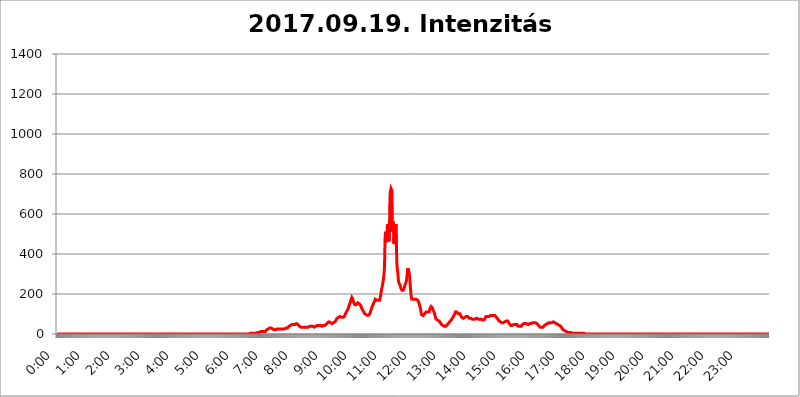
| Category | 2017.09.19. Intenzitás [W/m^2] |
|---|---|
| 0.0 | 0 |
| 0.0006944444444444445 | 0 |
| 0.001388888888888889 | 0 |
| 0.0020833333333333333 | 0 |
| 0.002777777777777778 | 0 |
| 0.003472222222222222 | 0 |
| 0.004166666666666667 | 0 |
| 0.004861111111111111 | 0 |
| 0.005555555555555556 | 0 |
| 0.0062499999999999995 | 0 |
| 0.006944444444444444 | 0 |
| 0.007638888888888889 | 0 |
| 0.008333333333333333 | 0 |
| 0.009027777777777779 | 0 |
| 0.009722222222222222 | 0 |
| 0.010416666666666666 | 0 |
| 0.011111111111111112 | 0 |
| 0.011805555555555555 | 0 |
| 0.012499999999999999 | 0 |
| 0.013194444444444444 | 0 |
| 0.013888888888888888 | 0 |
| 0.014583333333333332 | 0 |
| 0.015277777777777777 | 0 |
| 0.015972222222222224 | 0 |
| 0.016666666666666666 | 0 |
| 0.017361111111111112 | 0 |
| 0.018055555555555557 | 0 |
| 0.01875 | 0 |
| 0.019444444444444445 | 0 |
| 0.02013888888888889 | 0 |
| 0.020833333333333332 | 0 |
| 0.02152777777777778 | 0 |
| 0.022222222222222223 | 0 |
| 0.02291666666666667 | 0 |
| 0.02361111111111111 | 0 |
| 0.024305555555555556 | 0 |
| 0.024999999999999998 | 0 |
| 0.025694444444444447 | 0 |
| 0.02638888888888889 | 0 |
| 0.027083333333333334 | 0 |
| 0.027777777777777776 | 0 |
| 0.02847222222222222 | 0 |
| 0.029166666666666664 | 0 |
| 0.029861111111111113 | 0 |
| 0.030555555555555555 | 0 |
| 0.03125 | 0 |
| 0.03194444444444445 | 0 |
| 0.03263888888888889 | 0 |
| 0.03333333333333333 | 0 |
| 0.034027777777777775 | 0 |
| 0.034722222222222224 | 0 |
| 0.035416666666666666 | 0 |
| 0.036111111111111115 | 0 |
| 0.03680555555555556 | 0 |
| 0.0375 | 0 |
| 0.03819444444444444 | 0 |
| 0.03888888888888889 | 0 |
| 0.03958333333333333 | 0 |
| 0.04027777777777778 | 0 |
| 0.04097222222222222 | 0 |
| 0.041666666666666664 | 0 |
| 0.042361111111111106 | 0 |
| 0.04305555555555556 | 0 |
| 0.043750000000000004 | 0 |
| 0.044444444444444446 | 0 |
| 0.04513888888888889 | 0 |
| 0.04583333333333334 | 0 |
| 0.04652777777777778 | 0 |
| 0.04722222222222222 | 0 |
| 0.04791666666666666 | 0 |
| 0.04861111111111111 | 0 |
| 0.049305555555555554 | 0 |
| 0.049999999999999996 | 0 |
| 0.05069444444444445 | 0 |
| 0.051388888888888894 | 0 |
| 0.052083333333333336 | 0 |
| 0.05277777777777778 | 0 |
| 0.05347222222222222 | 0 |
| 0.05416666666666667 | 0 |
| 0.05486111111111111 | 0 |
| 0.05555555555555555 | 0 |
| 0.05625 | 0 |
| 0.05694444444444444 | 0 |
| 0.057638888888888885 | 0 |
| 0.05833333333333333 | 0 |
| 0.05902777777777778 | 0 |
| 0.059722222222222225 | 0 |
| 0.06041666666666667 | 0 |
| 0.061111111111111116 | 0 |
| 0.06180555555555556 | 0 |
| 0.0625 | 0 |
| 0.06319444444444444 | 0 |
| 0.06388888888888888 | 0 |
| 0.06458333333333334 | 0 |
| 0.06527777777777778 | 0 |
| 0.06597222222222222 | 0 |
| 0.06666666666666667 | 0 |
| 0.06736111111111111 | 0 |
| 0.06805555555555555 | 0 |
| 0.06874999999999999 | 0 |
| 0.06944444444444443 | 0 |
| 0.07013888888888889 | 0 |
| 0.07083333333333333 | 0 |
| 0.07152777777777779 | 0 |
| 0.07222222222222223 | 0 |
| 0.07291666666666667 | 0 |
| 0.07361111111111111 | 0 |
| 0.07430555555555556 | 0 |
| 0.075 | 0 |
| 0.07569444444444444 | 0 |
| 0.0763888888888889 | 0 |
| 0.07708333333333334 | 0 |
| 0.07777777777777778 | 0 |
| 0.07847222222222222 | 0 |
| 0.07916666666666666 | 0 |
| 0.0798611111111111 | 0 |
| 0.08055555555555556 | 0 |
| 0.08125 | 0 |
| 0.08194444444444444 | 0 |
| 0.08263888888888889 | 0 |
| 0.08333333333333333 | 0 |
| 0.08402777777777777 | 0 |
| 0.08472222222222221 | 0 |
| 0.08541666666666665 | 0 |
| 0.08611111111111112 | 0 |
| 0.08680555555555557 | 0 |
| 0.08750000000000001 | 0 |
| 0.08819444444444445 | 0 |
| 0.08888888888888889 | 0 |
| 0.08958333333333333 | 0 |
| 0.09027777777777778 | 0 |
| 0.09097222222222222 | 0 |
| 0.09166666666666667 | 0 |
| 0.09236111111111112 | 0 |
| 0.09305555555555556 | 0 |
| 0.09375 | 0 |
| 0.09444444444444444 | 0 |
| 0.09513888888888888 | 0 |
| 0.09583333333333333 | 0 |
| 0.09652777777777777 | 0 |
| 0.09722222222222222 | 0 |
| 0.09791666666666667 | 0 |
| 0.09861111111111111 | 0 |
| 0.09930555555555555 | 0 |
| 0.09999999999999999 | 0 |
| 0.10069444444444443 | 0 |
| 0.1013888888888889 | 0 |
| 0.10208333333333335 | 0 |
| 0.10277777777777779 | 0 |
| 0.10347222222222223 | 0 |
| 0.10416666666666667 | 0 |
| 0.10486111111111111 | 0 |
| 0.10555555555555556 | 0 |
| 0.10625 | 0 |
| 0.10694444444444444 | 0 |
| 0.1076388888888889 | 0 |
| 0.10833333333333334 | 0 |
| 0.10902777777777778 | 0 |
| 0.10972222222222222 | 0 |
| 0.1111111111111111 | 0 |
| 0.11180555555555556 | 0 |
| 0.11180555555555556 | 0 |
| 0.1125 | 0 |
| 0.11319444444444444 | 0 |
| 0.11388888888888889 | 0 |
| 0.11458333333333333 | 0 |
| 0.11527777777777777 | 0 |
| 0.11597222222222221 | 0 |
| 0.11666666666666665 | 0 |
| 0.1173611111111111 | 0 |
| 0.11805555555555557 | 0 |
| 0.11944444444444445 | 0 |
| 0.12013888888888889 | 0 |
| 0.12083333333333333 | 0 |
| 0.12152777777777778 | 0 |
| 0.12222222222222223 | 0 |
| 0.12291666666666667 | 0 |
| 0.12291666666666667 | 0 |
| 0.12361111111111112 | 0 |
| 0.12430555555555556 | 0 |
| 0.125 | 0 |
| 0.12569444444444444 | 0 |
| 0.12638888888888888 | 0 |
| 0.12708333333333333 | 0 |
| 0.16875 | 0 |
| 0.12847222222222224 | 0 |
| 0.12916666666666668 | 0 |
| 0.12986111111111112 | 0 |
| 0.13055555555555556 | 0 |
| 0.13125 | 0 |
| 0.13194444444444445 | 0 |
| 0.1326388888888889 | 0 |
| 0.13333333333333333 | 0 |
| 0.13402777777777777 | 0 |
| 0.13402777777777777 | 0 |
| 0.13472222222222222 | 0 |
| 0.13541666666666666 | 0 |
| 0.1361111111111111 | 0 |
| 0.13749999999999998 | 0 |
| 0.13819444444444443 | 0 |
| 0.1388888888888889 | 0 |
| 0.13958333333333334 | 0 |
| 0.14027777777777778 | 0 |
| 0.14097222222222222 | 0 |
| 0.14166666666666666 | 0 |
| 0.1423611111111111 | 0 |
| 0.14305555555555557 | 0 |
| 0.14375000000000002 | 0 |
| 0.14444444444444446 | 0 |
| 0.1451388888888889 | 0 |
| 0.1451388888888889 | 0 |
| 0.14652777777777778 | 0 |
| 0.14722222222222223 | 0 |
| 0.14791666666666667 | 0 |
| 0.1486111111111111 | 0 |
| 0.14930555555555555 | 0 |
| 0.15 | 0 |
| 0.15069444444444444 | 0 |
| 0.15138888888888888 | 0 |
| 0.15208333333333332 | 0 |
| 0.15277777777777776 | 0 |
| 0.15347222222222223 | 0 |
| 0.15416666666666667 | 0 |
| 0.15486111111111112 | 0 |
| 0.15555555555555556 | 0 |
| 0.15625 | 0 |
| 0.15694444444444444 | 0 |
| 0.15763888888888888 | 0 |
| 0.15833333333333333 | 0 |
| 0.15902777777777777 | 0 |
| 0.15972222222222224 | 0 |
| 0.16041666666666668 | 0 |
| 0.16111111111111112 | 0 |
| 0.16180555555555556 | 0 |
| 0.1625 | 0 |
| 0.16319444444444445 | 0 |
| 0.1638888888888889 | 0 |
| 0.16458333333333333 | 0 |
| 0.16527777777777777 | 0 |
| 0.16597222222222222 | 0 |
| 0.16666666666666666 | 0 |
| 0.1673611111111111 | 0 |
| 0.16805555555555554 | 0 |
| 0.16874999999999998 | 0 |
| 0.16944444444444443 | 0 |
| 0.17013888888888887 | 0 |
| 0.1708333333333333 | 0 |
| 0.17152777777777775 | 0 |
| 0.17222222222222225 | 0 |
| 0.1729166666666667 | 0 |
| 0.17361111111111113 | 0 |
| 0.17430555555555557 | 0 |
| 0.17500000000000002 | 0 |
| 0.17569444444444446 | 0 |
| 0.1763888888888889 | 0 |
| 0.17708333333333334 | 0 |
| 0.17777777777777778 | 0 |
| 0.17847222222222223 | 0 |
| 0.17916666666666667 | 0 |
| 0.1798611111111111 | 0 |
| 0.18055555555555555 | 0 |
| 0.18125 | 0 |
| 0.18194444444444444 | 0 |
| 0.1826388888888889 | 0 |
| 0.18333333333333335 | 0 |
| 0.1840277777777778 | 0 |
| 0.18472222222222223 | 0 |
| 0.18541666666666667 | 0 |
| 0.18611111111111112 | 0 |
| 0.18680555555555556 | 0 |
| 0.1875 | 0 |
| 0.18819444444444444 | 0 |
| 0.18888888888888888 | 0 |
| 0.18958333333333333 | 0 |
| 0.19027777777777777 | 0 |
| 0.1909722222222222 | 0 |
| 0.19166666666666665 | 0 |
| 0.19236111111111112 | 0 |
| 0.19305555555555554 | 0 |
| 0.19375 | 0 |
| 0.19444444444444445 | 0 |
| 0.1951388888888889 | 0 |
| 0.19583333333333333 | 0 |
| 0.19652777777777777 | 0 |
| 0.19722222222222222 | 0 |
| 0.19791666666666666 | 0 |
| 0.1986111111111111 | 0 |
| 0.19930555555555554 | 0 |
| 0.19999999999999998 | 0 |
| 0.20069444444444443 | 0 |
| 0.20138888888888887 | 0 |
| 0.2020833333333333 | 0 |
| 0.2027777777777778 | 0 |
| 0.2034722222222222 | 0 |
| 0.2041666666666667 | 0 |
| 0.20486111111111113 | 0 |
| 0.20555555555555557 | 0 |
| 0.20625000000000002 | 0 |
| 0.20694444444444446 | 0 |
| 0.2076388888888889 | 0 |
| 0.20833333333333334 | 0 |
| 0.20902777777777778 | 0 |
| 0.20972222222222223 | 0 |
| 0.21041666666666667 | 0 |
| 0.2111111111111111 | 0 |
| 0.21180555555555555 | 0 |
| 0.2125 | 0 |
| 0.21319444444444444 | 0 |
| 0.2138888888888889 | 0 |
| 0.21458333333333335 | 0 |
| 0.2152777777777778 | 0 |
| 0.21597222222222223 | 0 |
| 0.21666666666666667 | 0 |
| 0.21736111111111112 | 0 |
| 0.21805555555555556 | 0 |
| 0.21875 | 0 |
| 0.21944444444444444 | 0 |
| 0.22013888888888888 | 0 |
| 0.22083333333333333 | 0 |
| 0.22152777777777777 | 0 |
| 0.2222222222222222 | 0 |
| 0.22291666666666665 | 0 |
| 0.2236111111111111 | 0 |
| 0.22430555555555556 | 0 |
| 0.225 | 0 |
| 0.22569444444444445 | 0 |
| 0.2263888888888889 | 0 |
| 0.22708333333333333 | 0 |
| 0.22777777777777777 | 0 |
| 0.22847222222222222 | 0 |
| 0.22916666666666666 | 0 |
| 0.2298611111111111 | 0 |
| 0.23055555555555554 | 0 |
| 0.23124999999999998 | 0 |
| 0.23194444444444443 | 0 |
| 0.23263888888888887 | 0 |
| 0.2333333333333333 | 0 |
| 0.2340277777777778 | 0 |
| 0.2347222222222222 | 0 |
| 0.2354166666666667 | 0 |
| 0.23611111111111113 | 0 |
| 0.23680555555555557 | 0 |
| 0.23750000000000002 | 0 |
| 0.23819444444444446 | 0 |
| 0.2388888888888889 | 0 |
| 0.23958333333333334 | 0 |
| 0.24027777777777778 | 0 |
| 0.24097222222222223 | 0 |
| 0.24166666666666667 | 0 |
| 0.2423611111111111 | 0 |
| 0.24305555555555555 | 0 |
| 0.24375 | 0 |
| 0.24444444444444446 | 0 |
| 0.24513888888888888 | 0 |
| 0.24583333333333335 | 0 |
| 0.2465277777777778 | 0 |
| 0.24722222222222223 | 0 |
| 0.24791666666666667 | 0 |
| 0.24861111111111112 | 0 |
| 0.24930555555555556 | 0 |
| 0.25 | 0 |
| 0.25069444444444444 | 0 |
| 0.2513888888888889 | 0 |
| 0.2520833333333333 | 0 |
| 0.25277777777777777 | 0 |
| 0.2534722222222222 | 0 |
| 0.25416666666666665 | 0 |
| 0.2548611111111111 | 0 |
| 0.2555555555555556 | 0 |
| 0.25625000000000003 | 0 |
| 0.2569444444444445 | 0 |
| 0.2576388888888889 | 0 |
| 0.25833333333333336 | 0 |
| 0.2590277777777778 | 0 |
| 0.25972222222222224 | 0 |
| 0.2604166666666667 | 0 |
| 0.2611111111111111 | 0 |
| 0.26180555555555557 | 0 |
| 0.2625 | 0 |
| 0.26319444444444445 | 0 |
| 0.2638888888888889 | 0 |
| 0.26458333333333334 | 0 |
| 0.2652777777777778 | 0 |
| 0.2659722222222222 | 0 |
| 0.26666666666666666 | 0 |
| 0.2673611111111111 | 0 |
| 0.26805555555555555 | 0 |
| 0.26875 | 0 |
| 0.26944444444444443 | 0 |
| 0.2701388888888889 | 0 |
| 0.2708333333333333 | 3.525 |
| 0.27152777777777776 | 3.525 |
| 0.2722222222222222 | 3.525 |
| 0.27291666666666664 | 3.525 |
| 0.2736111111111111 | 3.525 |
| 0.2743055555555555 | 3.525 |
| 0.27499999999999997 | 3.525 |
| 0.27569444444444446 | 3.525 |
| 0.27638888888888885 | 3.525 |
| 0.27708333333333335 | 3.525 |
| 0.2777777777777778 | 3.525 |
| 0.27847222222222223 | 3.525 |
| 0.2791666666666667 | 3.525 |
| 0.2798611111111111 | 7.887 |
| 0.28055555555555556 | 7.887 |
| 0.28125 | 7.887 |
| 0.28194444444444444 | 7.887 |
| 0.2826388888888889 | 7.887 |
| 0.2833333333333333 | 7.887 |
| 0.28402777777777777 | 12.257 |
| 0.2847222222222222 | 12.257 |
| 0.28541666666666665 | 12.257 |
| 0.28611111111111115 | 12.257 |
| 0.28680555555555554 | 12.257 |
| 0.28750000000000003 | 12.257 |
| 0.2881944444444445 | 12.257 |
| 0.2888888888888889 | 12.257 |
| 0.28958333333333336 | 12.257 |
| 0.2902777777777778 | 12.257 |
| 0.29097222222222224 | 12.257 |
| 0.2916666666666667 | 12.257 |
| 0.2923611111111111 | 16.636 |
| 0.29305555555555557 | 16.636 |
| 0.29375 | 21.024 |
| 0.29444444444444445 | 21.024 |
| 0.2951388888888889 | 21.024 |
| 0.29583333333333334 | 25.419 |
| 0.2965277777777778 | 29.823 |
| 0.2972222222222222 | 29.823 |
| 0.29791666666666666 | 29.823 |
| 0.2986111111111111 | 29.823 |
| 0.29930555555555555 | 29.823 |
| 0.3 | 29.823 |
| 0.30069444444444443 | 25.419 |
| 0.3013888888888889 | 25.419 |
| 0.3020833333333333 | 25.419 |
| 0.30277777777777776 | 21.024 |
| 0.3034722222222222 | 21.024 |
| 0.30416666666666664 | 21.024 |
| 0.3048611111111111 | 21.024 |
| 0.3055555555555555 | 21.024 |
| 0.30624999999999997 | 21.024 |
| 0.3069444444444444 | 21.024 |
| 0.3076388888888889 | 21.024 |
| 0.30833333333333335 | 25.419 |
| 0.3090277777777778 | 25.419 |
| 0.30972222222222223 | 25.419 |
| 0.3104166666666667 | 25.419 |
| 0.3111111111111111 | 25.419 |
| 0.31180555555555556 | 25.419 |
| 0.3125 | 25.419 |
| 0.31319444444444444 | 25.419 |
| 0.3138888888888889 | 25.419 |
| 0.3145833333333333 | 25.419 |
| 0.31527777777777777 | 25.419 |
| 0.3159722222222222 | 25.419 |
| 0.31666666666666665 | 25.419 |
| 0.31736111111111115 | 25.419 |
| 0.31805555555555554 | 25.419 |
| 0.31875000000000003 | 25.419 |
| 0.3194444444444445 | 25.419 |
| 0.3201388888888889 | 25.419 |
| 0.32083333333333336 | 29.823 |
| 0.3215277777777778 | 29.823 |
| 0.32222222222222224 | 29.823 |
| 0.3229166666666667 | 29.823 |
| 0.3236111111111111 | 29.823 |
| 0.32430555555555557 | 34.234 |
| 0.325 | 38.653 |
| 0.32569444444444445 | 38.653 |
| 0.3263888888888889 | 43.079 |
| 0.32708333333333334 | 43.079 |
| 0.3277777777777778 | 47.511 |
| 0.3284722222222222 | 47.511 |
| 0.32916666666666666 | 47.511 |
| 0.3298611111111111 | 47.511 |
| 0.33055555555555555 | 47.511 |
| 0.33125 | 47.511 |
| 0.33194444444444443 | 47.511 |
| 0.3326388888888889 | 47.511 |
| 0.3333333333333333 | 47.511 |
| 0.3340277777777778 | 47.511 |
| 0.3347222222222222 | 51.951 |
| 0.3354166666666667 | 51.951 |
| 0.3361111111111111 | 51.951 |
| 0.3368055555555556 | 51.951 |
| 0.33749999999999997 | 47.511 |
| 0.33819444444444446 | 47.511 |
| 0.33888888888888885 | 43.079 |
| 0.33958333333333335 | 38.653 |
| 0.34027777777777773 | 38.653 |
| 0.34097222222222223 | 34.234 |
| 0.3416666666666666 | 34.234 |
| 0.3423611111111111 | 34.234 |
| 0.3430555555555555 | 34.234 |
| 0.34375 | 34.234 |
| 0.3444444444444445 | 34.234 |
| 0.3451388888888889 | 34.234 |
| 0.3458333333333334 | 34.234 |
| 0.34652777777777777 | 34.234 |
| 0.34722222222222227 | 34.234 |
| 0.34791666666666665 | 34.234 |
| 0.34861111111111115 | 34.234 |
| 0.34930555555555554 | 34.234 |
| 0.35000000000000003 | 34.234 |
| 0.3506944444444444 | 34.234 |
| 0.3513888888888889 | 34.234 |
| 0.3520833333333333 | 34.234 |
| 0.3527777777777778 | 38.653 |
| 0.3534722222222222 | 38.653 |
| 0.3541666666666667 | 38.653 |
| 0.3548611111111111 | 38.653 |
| 0.35555555555555557 | 38.653 |
| 0.35625 | 38.653 |
| 0.35694444444444445 | 38.653 |
| 0.3576388888888889 | 38.653 |
| 0.35833333333333334 | 38.653 |
| 0.3590277777777778 | 34.234 |
| 0.3597222222222222 | 34.234 |
| 0.36041666666666666 | 34.234 |
| 0.3611111111111111 | 34.234 |
| 0.36180555555555555 | 38.653 |
| 0.3625 | 38.653 |
| 0.36319444444444443 | 38.653 |
| 0.3638888888888889 | 38.653 |
| 0.3645833333333333 | 43.079 |
| 0.3652777777777778 | 43.079 |
| 0.3659722222222222 | 43.079 |
| 0.3666666666666667 | 43.079 |
| 0.3673611111111111 | 43.079 |
| 0.3680555555555556 | 43.079 |
| 0.36874999999999997 | 43.079 |
| 0.36944444444444446 | 43.079 |
| 0.37013888888888885 | 43.079 |
| 0.37083333333333335 | 38.653 |
| 0.37152777777777773 | 43.079 |
| 0.37222222222222223 | 43.079 |
| 0.3729166666666666 | 43.079 |
| 0.3736111111111111 | 43.079 |
| 0.3743055555555555 | 43.079 |
| 0.375 | 43.079 |
| 0.3756944444444445 | 43.079 |
| 0.3763888888888889 | 47.511 |
| 0.3770833333333334 | 47.511 |
| 0.37777777777777777 | 51.951 |
| 0.37847222222222227 | 51.951 |
| 0.37916666666666665 | 56.398 |
| 0.37986111111111115 | 60.85 |
| 0.38055555555555554 | 60.85 |
| 0.38125000000000003 | 60.85 |
| 0.3819444444444444 | 60.85 |
| 0.3826388888888889 | 56.398 |
| 0.3833333333333333 | 56.398 |
| 0.3840277777777778 | 56.398 |
| 0.3847222222222222 | 51.951 |
| 0.3854166666666667 | 51.951 |
| 0.3861111111111111 | 51.951 |
| 0.38680555555555557 | 51.951 |
| 0.3875 | 56.398 |
| 0.38819444444444445 | 56.398 |
| 0.3888888888888889 | 60.85 |
| 0.38958333333333334 | 60.85 |
| 0.3902777777777778 | 65.31 |
| 0.3909722222222222 | 69.775 |
| 0.39166666666666666 | 74.246 |
| 0.3923611111111111 | 78.722 |
| 0.39305555555555555 | 83.205 |
| 0.39375 | 83.205 |
| 0.39444444444444443 | 83.205 |
| 0.3951388888888889 | 87.692 |
| 0.3958333333333333 | 87.692 |
| 0.3965277777777778 | 87.692 |
| 0.3972222222222222 | 87.692 |
| 0.3979166666666667 | 83.205 |
| 0.3986111111111111 | 83.205 |
| 0.3993055555555556 | 83.205 |
| 0.39999999999999997 | 78.722 |
| 0.40069444444444446 | 83.205 |
| 0.40138888888888885 | 83.205 |
| 0.40208333333333335 | 83.205 |
| 0.40277777777777773 | 87.692 |
| 0.40347222222222223 | 92.184 |
| 0.4041666666666666 | 101.184 |
| 0.4048611111111111 | 101.184 |
| 0.4055555555555555 | 110.201 |
| 0.40625 | 114.716 |
| 0.4069444444444445 | 119.235 |
| 0.4076388888888889 | 123.758 |
| 0.4083333333333334 | 128.284 |
| 0.40902777777777777 | 137.347 |
| 0.40972222222222227 | 146.423 |
| 0.41041666666666665 | 150.964 |
| 0.41111111111111115 | 160.056 |
| 0.41180555555555554 | 169.156 |
| 0.41250000000000003 | 173.709 |
| 0.4131944444444444 | 182.82 |
| 0.4138888888888889 | 182.82 |
| 0.4145833333333333 | 173.709 |
| 0.4152777777777778 | 164.605 |
| 0.4159722222222222 | 155.509 |
| 0.4166666666666667 | 150.964 |
| 0.4173611111111111 | 146.423 |
| 0.41805555555555557 | 141.884 |
| 0.41875 | 141.884 |
| 0.41944444444444445 | 146.423 |
| 0.4201388888888889 | 146.423 |
| 0.42083333333333334 | 150.964 |
| 0.4215277777777778 | 155.509 |
| 0.4222222222222222 | 155.509 |
| 0.42291666666666666 | 155.509 |
| 0.4236111111111111 | 150.964 |
| 0.42430555555555555 | 150.964 |
| 0.425 | 146.423 |
| 0.42569444444444443 | 141.884 |
| 0.4263888888888889 | 137.347 |
| 0.4270833333333333 | 128.284 |
| 0.4277777777777778 | 123.758 |
| 0.4284722222222222 | 119.235 |
| 0.4291666666666667 | 114.716 |
| 0.4298611111111111 | 110.201 |
| 0.4305555555555556 | 105.69 |
| 0.43124999999999997 | 101.184 |
| 0.43194444444444446 | 101.184 |
| 0.43263888888888885 | 96.682 |
| 0.43333333333333335 | 96.682 |
| 0.43402777777777773 | 92.184 |
| 0.43472222222222223 | 92.184 |
| 0.4354166666666666 | 92.184 |
| 0.4361111111111111 | 92.184 |
| 0.4368055555555555 | 92.184 |
| 0.4375 | 96.682 |
| 0.4381944444444445 | 101.184 |
| 0.4388888888888889 | 105.69 |
| 0.4395833333333334 | 114.716 |
| 0.44027777777777777 | 119.235 |
| 0.44097222222222227 | 128.284 |
| 0.44166666666666665 | 137.347 |
| 0.44236111111111115 | 141.884 |
| 0.44305555555555554 | 146.423 |
| 0.44375000000000003 | 155.509 |
| 0.4444444444444444 | 160.056 |
| 0.4451388888888889 | 164.605 |
| 0.4458333333333333 | 173.709 |
| 0.4465277777777778 | 173.709 |
| 0.4472222222222222 | 173.709 |
| 0.4479166666666667 | 169.156 |
| 0.4486111111111111 | 164.605 |
| 0.44930555555555557 | 164.605 |
| 0.45 | 169.156 |
| 0.45069444444444445 | 169.156 |
| 0.4513888888888889 | 169.156 |
| 0.45208333333333334 | 169.156 |
| 0.4527777777777778 | 178.264 |
| 0.4534722222222222 | 191.937 |
| 0.45416666666666666 | 205.62 |
| 0.4548611111111111 | 223.873 |
| 0.45555555555555555 | 233 |
| 0.45625 | 246.689 |
| 0.45694444444444443 | 260.373 |
| 0.4576388888888889 | 278.603 |
| 0.4583333333333333 | 301.354 |
| 0.4590277777777778 | 342.162 |
| 0.4597222222222222 | 471.582 |
| 0.4604166666666667 | 510.885 |
| 0.4611111111111111 | 458.38 |
| 0.4618055555555556 | 462.786 |
| 0.46249999999999997 | 502.192 |
| 0.46319444444444446 | 549.704 |
| 0.46388888888888885 | 549.704 |
| 0.46458333333333335 | 502.192 |
| 0.46527777777777773 | 462.786 |
| 0.46597222222222223 | 523.88 |
| 0.4666666666666666 | 683.473 |
| 0.4673611111111111 | 715.858 |
| 0.4680555555555555 | 727.896 |
| 0.46875 | 727.896 |
| 0.4694444444444445 | 715.858 |
| 0.4701388888888889 | 510.885 |
| 0.4708333333333334 | 562.53 |
| 0.47152777777777777 | 536.82 |
| 0.47222222222222227 | 449.551 |
| 0.47291666666666665 | 528.2 |
| 0.47361111111111115 | 510.885 |
| 0.47430555555555554 | 536.82 |
| 0.47500000000000003 | 549.704 |
| 0.4756944444444444 | 431.833 |
| 0.4763888888888889 | 346.682 |
| 0.4770833333333333 | 324.052 |
| 0.4777777777777778 | 301.354 |
| 0.4784722222222222 | 269.49 |
| 0.4791666666666667 | 255.813 |
| 0.4798611111111111 | 251.251 |
| 0.48055555555555557 | 246.689 |
| 0.48125 | 237.564 |
| 0.48194444444444445 | 228.436 |
| 0.4826388888888889 | 223.873 |
| 0.48333333333333334 | 219.309 |
| 0.4840277777777778 | 214.746 |
| 0.4847222222222222 | 214.746 |
| 0.48541666666666666 | 219.309 |
| 0.4861111111111111 | 223.873 |
| 0.48680555555555555 | 233 |
| 0.4875 | 242.127 |
| 0.48819444444444443 | 246.689 |
| 0.4888888888888889 | 255.813 |
| 0.4895833333333333 | 264.932 |
| 0.4902777777777778 | 283.156 |
| 0.4909722222222222 | 305.898 |
| 0.4916666666666667 | 328.584 |
| 0.4923611111111111 | 324.052 |
| 0.4930555555555556 | 314.98 |
| 0.49374999999999997 | 301.354 |
| 0.49444444444444446 | 278.603 |
| 0.49513888888888885 | 242.127 |
| 0.49583333333333335 | 210.182 |
| 0.49652777777777773 | 187.378 |
| 0.49722222222222223 | 173.709 |
| 0.4979166666666666 | 169.156 |
| 0.4986111111111111 | 173.709 |
| 0.4993055555555555 | 173.709 |
| 0.5 | 178.264 |
| 0.5006944444444444 | 178.264 |
| 0.5013888888888889 | 173.709 |
| 0.5020833333333333 | 173.709 |
| 0.5027777777777778 | 173.709 |
| 0.5034722222222222 | 173.709 |
| 0.5041666666666667 | 173.709 |
| 0.5048611111111111 | 169.156 |
| 0.5055555555555555 | 169.156 |
| 0.50625 | 164.605 |
| 0.5069444444444444 | 160.056 |
| 0.5076388888888889 | 150.964 |
| 0.5083333333333333 | 141.884 |
| 0.5090277777777777 | 132.814 |
| 0.5097222222222222 | 119.235 |
| 0.5104166666666666 | 105.69 |
| 0.5111111111111112 | 96.682 |
| 0.5118055555555555 | 92.184 |
| 0.5125000000000001 | 92.184 |
| 0.5131944444444444 | 92.184 |
| 0.513888888888889 | 92.184 |
| 0.5145833333333333 | 92.184 |
| 0.5152777777777778 | 101.184 |
| 0.5159722222222222 | 101.184 |
| 0.5166666666666667 | 105.69 |
| 0.517361111111111 | 110.201 |
| 0.5180555555555556 | 110.201 |
| 0.5187499999999999 | 105.69 |
| 0.5194444444444445 | 110.201 |
| 0.5201388888888888 | 105.69 |
| 0.5208333333333334 | 110.201 |
| 0.5215277777777778 | 110.201 |
| 0.5222222222222223 | 119.235 |
| 0.5229166666666667 | 128.284 |
| 0.5236111111111111 | 132.814 |
| 0.5243055555555556 | 137.347 |
| 0.525 | 137.347 |
| 0.5256944444444445 | 137.347 |
| 0.5263888888888889 | 128.284 |
| 0.5270833333333333 | 119.235 |
| 0.5277777777777778 | 114.716 |
| 0.5284722222222222 | 110.201 |
| 0.5291666666666667 | 101.184 |
| 0.5298611111111111 | 92.184 |
| 0.5305555555555556 | 83.205 |
| 0.53125 | 74.246 |
| 0.5319444444444444 | 74.246 |
| 0.5326388888888889 | 74.246 |
| 0.5333333333333333 | 69.775 |
| 0.5340277777777778 | 69.775 |
| 0.5347222222222222 | 69.775 |
| 0.5354166666666667 | 65.31 |
| 0.5361111111111111 | 65.31 |
| 0.5368055555555555 | 60.85 |
| 0.5375 | 56.398 |
| 0.5381944444444444 | 51.951 |
| 0.5388888888888889 | 47.511 |
| 0.5395833333333333 | 43.079 |
| 0.5402777777777777 | 43.079 |
| 0.5409722222222222 | 43.079 |
| 0.5416666666666666 | 38.653 |
| 0.5423611111111112 | 38.653 |
| 0.5430555555555555 | 38.653 |
| 0.5437500000000001 | 38.653 |
| 0.5444444444444444 | 38.653 |
| 0.545138888888889 | 38.653 |
| 0.5458333333333333 | 43.079 |
| 0.5465277777777778 | 43.079 |
| 0.5472222222222222 | 47.511 |
| 0.5479166666666667 | 51.951 |
| 0.548611111111111 | 51.951 |
| 0.5493055555555556 | 56.398 |
| 0.5499999999999999 | 56.398 |
| 0.5506944444444445 | 60.85 |
| 0.5513888888888888 | 65.31 |
| 0.5520833333333334 | 65.31 |
| 0.5527777777777778 | 69.775 |
| 0.5534722222222223 | 74.246 |
| 0.5541666666666667 | 78.722 |
| 0.5548611111111111 | 83.205 |
| 0.5555555555555556 | 87.692 |
| 0.55625 | 92.184 |
| 0.5569444444444445 | 96.682 |
| 0.5576388888888889 | 101.184 |
| 0.5583333333333333 | 110.201 |
| 0.5590277777777778 | 110.201 |
| 0.5597222222222222 | 110.201 |
| 0.5604166666666667 | 110.201 |
| 0.5611111111111111 | 110.201 |
| 0.5618055555555556 | 105.69 |
| 0.5625 | 101.184 |
| 0.5631944444444444 | 101.184 |
| 0.5638888888888889 | 101.184 |
| 0.5645833333333333 | 101.184 |
| 0.5652777777777778 | 96.682 |
| 0.5659722222222222 | 92.184 |
| 0.5666666666666667 | 87.692 |
| 0.5673611111111111 | 83.205 |
| 0.5680555555555555 | 83.205 |
| 0.56875 | 78.722 |
| 0.5694444444444444 | 78.722 |
| 0.5701388888888889 | 83.205 |
| 0.5708333333333333 | 83.205 |
| 0.5715277777777777 | 83.205 |
| 0.5722222222222222 | 83.205 |
| 0.5729166666666666 | 87.692 |
| 0.5736111111111112 | 87.692 |
| 0.5743055555555555 | 87.692 |
| 0.5750000000000001 | 87.692 |
| 0.5756944444444444 | 87.692 |
| 0.576388888888889 | 83.205 |
| 0.5770833333333333 | 83.205 |
| 0.5777777777777778 | 78.722 |
| 0.5784722222222222 | 78.722 |
| 0.5791666666666667 | 78.722 |
| 0.579861111111111 | 78.722 |
| 0.5805555555555556 | 78.722 |
| 0.5812499999999999 | 74.246 |
| 0.5819444444444445 | 74.246 |
| 0.5826388888888888 | 74.246 |
| 0.5833333333333334 | 74.246 |
| 0.5840277777777778 | 74.246 |
| 0.5847222222222223 | 74.246 |
| 0.5854166666666667 | 74.246 |
| 0.5861111111111111 | 74.246 |
| 0.5868055555555556 | 78.722 |
| 0.5875 | 78.722 |
| 0.5881944444444445 | 78.722 |
| 0.5888888888888889 | 78.722 |
| 0.5895833333333333 | 74.246 |
| 0.5902777777777778 | 74.246 |
| 0.5909722222222222 | 74.246 |
| 0.5916666666666667 | 74.246 |
| 0.5923611111111111 | 74.246 |
| 0.5930555555555556 | 78.722 |
| 0.59375 | 78.722 |
| 0.5944444444444444 | 74.246 |
| 0.5951388888888889 | 74.246 |
| 0.5958333333333333 | 74.246 |
| 0.5965277777777778 | 69.775 |
| 0.5972222222222222 | 69.775 |
| 0.5979166666666667 | 69.775 |
| 0.5986111111111111 | 69.775 |
| 0.5993055555555555 | 74.246 |
| 0.6 | 78.722 |
| 0.6006944444444444 | 83.205 |
| 0.6013888888888889 | 87.692 |
| 0.6020833333333333 | 87.692 |
| 0.6027777777777777 | 92.184 |
| 0.6034722222222222 | 87.692 |
| 0.6041666666666666 | 92.184 |
| 0.6048611111111112 | 87.692 |
| 0.6055555555555555 | 87.692 |
| 0.6062500000000001 | 92.184 |
| 0.6069444444444444 | 92.184 |
| 0.607638888888889 | 92.184 |
| 0.6083333333333333 | 92.184 |
| 0.6090277777777778 | 92.184 |
| 0.6097222222222222 | 92.184 |
| 0.6104166666666667 | 92.184 |
| 0.611111111111111 | 92.184 |
| 0.6118055555555556 | 92.184 |
| 0.6124999999999999 | 92.184 |
| 0.6131944444444445 | 92.184 |
| 0.6138888888888888 | 92.184 |
| 0.6145833333333334 | 92.184 |
| 0.6152777777777778 | 87.692 |
| 0.6159722222222223 | 83.205 |
| 0.6166666666666667 | 83.205 |
| 0.6173611111111111 | 78.722 |
| 0.6180555555555556 | 74.246 |
| 0.61875 | 69.775 |
| 0.6194444444444445 | 65.31 |
| 0.6201388888888889 | 65.31 |
| 0.6208333333333333 | 60.85 |
| 0.6215277777777778 | 60.85 |
| 0.6222222222222222 | 60.85 |
| 0.6229166666666667 | 56.398 |
| 0.6236111111111111 | 56.398 |
| 0.6243055555555556 | 56.398 |
| 0.625 | 56.398 |
| 0.6256944444444444 | 56.398 |
| 0.6263888888888889 | 56.398 |
| 0.6270833333333333 | 60.85 |
| 0.6277777777777778 | 60.85 |
| 0.6284722222222222 | 65.31 |
| 0.6291666666666667 | 65.31 |
| 0.6298611111111111 | 65.31 |
| 0.6305555555555555 | 65.31 |
| 0.63125 | 65.31 |
| 0.6319444444444444 | 65.31 |
| 0.6326388888888889 | 60.85 |
| 0.6333333333333333 | 60.85 |
| 0.6340277777777777 | 51.951 |
| 0.6347222222222222 | 47.511 |
| 0.6354166666666666 | 47.511 |
| 0.6361111111111112 | 43.079 |
| 0.6368055555555555 | 43.079 |
| 0.6375000000000001 | 43.079 |
| 0.6381944444444444 | 43.079 |
| 0.638888888888889 | 43.079 |
| 0.6395833333333333 | 47.511 |
| 0.6402777777777778 | 47.511 |
| 0.6409722222222222 | 47.511 |
| 0.6416666666666667 | 47.511 |
| 0.642361111111111 | 47.511 |
| 0.6430555555555556 | 47.511 |
| 0.6437499999999999 | 47.511 |
| 0.6444444444444445 | 47.511 |
| 0.6451388888888888 | 47.511 |
| 0.6458333333333334 | 43.079 |
| 0.6465277777777778 | 38.653 |
| 0.6472222222222223 | 38.653 |
| 0.6479166666666667 | 38.653 |
| 0.6486111111111111 | 38.653 |
| 0.6493055555555556 | 38.653 |
| 0.65 | 38.653 |
| 0.6506944444444445 | 38.653 |
| 0.6513888888888889 | 43.079 |
| 0.6520833333333333 | 47.511 |
| 0.6527777777777778 | 47.511 |
| 0.6534722222222222 | 47.511 |
| 0.6541666666666667 | 51.951 |
| 0.6548611111111111 | 51.951 |
| 0.6555555555555556 | 51.951 |
| 0.65625 | 51.951 |
| 0.6569444444444444 | 51.951 |
| 0.6576388888888889 | 51.951 |
| 0.6583333333333333 | 51.951 |
| 0.6590277777777778 | 47.511 |
| 0.6597222222222222 | 47.511 |
| 0.6604166666666667 | 47.511 |
| 0.6611111111111111 | 47.511 |
| 0.6618055555555555 | 47.511 |
| 0.6625 | 51.951 |
| 0.6631944444444444 | 51.951 |
| 0.6638888888888889 | 56.398 |
| 0.6645833333333333 | 51.951 |
| 0.6652777777777777 | 56.398 |
| 0.6659722222222222 | 56.398 |
| 0.6666666666666666 | 56.398 |
| 0.6673611111111111 | 56.398 |
| 0.6680555555555556 | 56.398 |
| 0.6687500000000001 | 56.398 |
| 0.6694444444444444 | 56.398 |
| 0.6701388888888888 | 51.951 |
| 0.6708333333333334 | 56.398 |
| 0.6715277777777778 | 56.398 |
| 0.6722222222222222 | 51.951 |
| 0.6729166666666666 | 51.951 |
| 0.6736111111111112 | 47.511 |
| 0.6743055555555556 | 47.511 |
| 0.6749999999999999 | 43.079 |
| 0.6756944444444444 | 38.653 |
| 0.6763888888888889 | 38.653 |
| 0.6770833333333334 | 34.234 |
| 0.6777777777777777 | 34.234 |
| 0.6784722222222223 | 34.234 |
| 0.6791666666666667 | 34.234 |
| 0.6798611111111111 | 34.234 |
| 0.6805555555555555 | 34.234 |
| 0.68125 | 34.234 |
| 0.6819444444444445 | 38.653 |
| 0.6826388888888889 | 38.653 |
| 0.6833333333333332 | 43.079 |
| 0.6840277777777778 | 43.079 |
| 0.6847222222222222 | 47.511 |
| 0.6854166666666667 | 47.511 |
| 0.686111111111111 | 47.511 |
| 0.6868055555555556 | 47.511 |
| 0.6875 | 51.951 |
| 0.6881944444444444 | 51.951 |
| 0.688888888888889 | 56.398 |
| 0.6895833333333333 | 56.398 |
| 0.6902777777777778 | 56.398 |
| 0.6909722222222222 | 60.85 |
| 0.6916666666666668 | 56.398 |
| 0.6923611111111111 | 56.398 |
| 0.6930555555555555 | 56.398 |
| 0.69375 | 56.398 |
| 0.6944444444444445 | 60.85 |
| 0.6951388888888889 | 60.85 |
| 0.6958333333333333 | 60.85 |
| 0.6965277777777777 | 60.85 |
| 0.6972222222222223 | 60.85 |
| 0.6979166666666666 | 56.398 |
| 0.6986111111111111 | 56.398 |
| 0.6993055555555556 | 51.951 |
| 0.7000000000000001 | 51.951 |
| 0.7006944444444444 | 51.951 |
| 0.7013888888888888 | 47.511 |
| 0.7020833333333334 | 47.511 |
| 0.7027777777777778 | 47.511 |
| 0.7034722222222222 | 43.079 |
| 0.7041666666666666 | 43.079 |
| 0.7048611111111112 | 43.079 |
| 0.7055555555555556 | 38.653 |
| 0.7062499999999999 | 38.653 |
| 0.7069444444444444 | 34.234 |
| 0.7076388888888889 | 29.823 |
| 0.7083333333333334 | 29.823 |
| 0.7090277777777777 | 25.419 |
| 0.7097222222222223 | 21.024 |
| 0.7104166666666667 | 21.024 |
| 0.7111111111111111 | 16.636 |
| 0.7118055555555555 | 16.636 |
| 0.7125 | 12.257 |
| 0.7131944444444445 | 12.257 |
| 0.7138888888888889 | 12.257 |
| 0.7145833333333332 | 12.257 |
| 0.7152777777777778 | 12.257 |
| 0.7159722222222222 | 7.887 |
| 0.7166666666666667 | 7.887 |
| 0.717361111111111 | 7.887 |
| 0.7180555555555556 | 7.887 |
| 0.71875 | 7.887 |
| 0.7194444444444444 | 7.887 |
| 0.720138888888889 | 7.887 |
| 0.7208333333333333 | 7.887 |
| 0.7215277777777778 | 3.525 |
| 0.7222222222222222 | 3.525 |
| 0.7229166666666668 | 3.525 |
| 0.7236111111111111 | 3.525 |
| 0.7243055555555555 | 3.525 |
| 0.725 | 3.525 |
| 0.7256944444444445 | 3.525 |
| 0.7263888888888889 | 3.525 |
| 0.7270833333333333 | 3.525 |
| 0.7277777777777777 | 3.525 |
| 0.7284722222222223 | 3.525 |
| 0.7291666666666666 | 3.525 |
| 0.7298611111111111 | 3.525 |
| 0.7305555555555556 | 3.525 |
| 0.7312500000000001 | 3.525 |
| 0.7319444444444444 | 3.525 |
| 0.7326388888888888 | 3.525 |
| 0.7333333333333334 | 3.525 |
| 0.7340277777777778 | 3.525 |
| 0.7347222222222222 | 3.525 |
| 0.7354166666666666 | 0 |
| 0.7361111111111112 | 3.525 |
| 0.7368055555555556 | 3.525 |
| 0.7374999999999999 | 0 |
| 0.7381944444444444 | 0 |
| 0.7388888888888889 | 3.525 |
| 0.7395833333333334 | 0 |
| 0.7402777777777777 | 0 |
| 0.7409722222222223 | 0 |
| 0.7416666666666667 | 0 |
| 0.7423611111111111 | 0 |
| 0.7430555555555555 | 0 |
| 0.74375 | 0 |
| 0.7444444444444445 | 3.525 |
| 0.7451388888888889 | 0 |
| 0.7458333333333332 | 0 |
| 0.7465277777777778 | 0 |
| 0.7472222222222222 | 0 |
| 0.7479166666666667 | 0 |
| 0.748611111111111 | 0 |
| 0.7493055555555556 | 0 |
| 0.75 | 0 |
| 0.7506944444444444 | 0 |
| 0.751388888888889 | 0 |
| 0.7520833333333333 | 0 |
| 0.7527777777777778 | 0 |
| 0.7534722222222222 | 0 |
| 0.7541666666666668 | 0 |
| 0.7548611111111111 | 0 |
| 0.7555555555555555 | 0 |
| 0.75625 | 0 |
| 0.7569444444444445 | 0 |
| 0.7576388888888889 | 0 |
| 0.7583333333333333 | 0 |
| 0.7590277777777777 | 0 |
| 0.7597222222222223 | 0 |
| 0.7604166666666666 | 0 |
| 0.7611111111111111 | 0 |
| 0.7618055555555556 | 0 |
| 0.7625000000000001 | 0 |
| 0.7631944444444444 | 0 |
| 0.7638888888888888 | 0 |
| 0.7645833333333334 | 0 |
| 0.7652777777777778 | 0 |
| 0.7659722222222222 | 0 |
| 0.7666666666666666 | 0 |
| 0.7673611111111112 | 0 |
| 0.7680555555555556 | 0 |
| 0.7687499999999999 | 0 |
| 0.7694444444444444 | 0 |
| 0.7701388888888889 | 0 |
| 0.7708333333333334 | 0 |
| 0.7715277777777777 | 0 |
| 0.7722222222222223 | 0 |
| 0.7729166666666667 | 0 |
| 0.7736111111111111 | 0 |
| 0.7743055555555555 | 0 |
| 0.775 | 0 |
| 0.7756944444444445 | 0 |
| 0.7763888888888889 | 0 |
| 0.7770833333333332 | 0 |
| 0.7777777777777778 | 0 |
| 0.7784722222222222 | 0 |
| 0.7791666666666667 | 0 |
| 0.779861111111111 | 0 |
| 0.7805555555555556 | 0 |
| 0.78125 | 0 |
| 0.7819444444444444 | 0 |
| 0.782638888888889 | 0 |
| 0.7833333333333333 | 0 |
| 0.7840277777777778 | 0 |
| 0.7847222222222222 | 0 |
| 0.7854166666666668 | 0 |
| 0.7861111111111111 | 0 |
| 0.7868055555555555 | 0 |
| 0.7875 | 0 |
| 0.7881944444444445 | 0 |
| 0.7888888888888889 | 0 |
| 0.7895833333333333 | 0 |
| 0.7902777777777777 | 0 |
| 0.7909722222222223 | 0 |
| 0.7916666666666666 | 0 |
| 0.7923611111111111 | 0 |
| 0.7930555555555556 | 0 |
| 0.7937500000000001 | 0 |
| 0.7944444444444444 | 0 |
| 0.7951388888888888 | 0 |
| 0.7958333333333334 | 0 |
| 0.7965277777777778 | 0 |
| 0.7972222222222222 | 0 |
| 0.7979166666666666 | 0 |
| 0.7986111111111112 | 0 |
| 0.7993055555555556 | 0 |
| 0.7999999999999999 | 0 |
| 0.8006944444444444 | 0 |
| 0.8013888888888889 | 0 |
| 0.8020833333333334 | 0 |
| 0.8027777777777777 | 0 |
| 0.8034722222222223 | 0 |
| 0.8041666666666667 | 0 |
| 0.8048611111111111 | 0 |
| 0.8055555555555555 | 0 |
| 0.80625 | 0 |
| 0.8069444444444445 | 0 |
| 0.8076388888888889 | 0 |
| 0.8083333333333332 | 0 |
| 0.8090277777777778 | 0 |
| 0.8097222222222222 | 0 |
| 0.8104166666666667 | 0 |
| 0.811111111111111 | 0 |
| 0.8118055555555556 | 0 |
| 0.8125 | 0 |
| 0.8131944444444444 | 0 |
| 0.813888888888889 | 0 |
| 0.8145833333333333 | 0 |
| 0.8152777777777778 | 0 |
| 0.8159722222222222 | 0 |
| 0.8166666666666668 | 0 |
| 0.8173611111111111 | 0 |
| 0.8180555555555555 | 0 |
| 0.81875 | 0 |
| 0.8194444444444445 | 0 |
| 0.8201388888888889 | 0 |
| 0.8208333333333333 | 0 |
| 0.8215277777777777 | 0 |
| 0.8222222222222223 | 0 |
| 0.8229166666666666 | 0 |
| 0.8236111111111111 | 0 |
| 0.8243055555555556 | 0 |
| 0.8250000000000001 | 0 |
| 0.8256944444444444 | 0 |
| 0.8263888888888888 | 0 |
| 0.8270833333333334 | 0 |
| 0.8277777777777778 | 0 |
| 0.8284722222222222 | 0 |
| 0.8291666666666666 | 0 |
| 0.8298611111111112 | 0 |
| 0.8305555555555556 | 0 |
| 0.8312499999999999 | 0 |
| 0.8319444444444444 | 0 |
| 0.8326388888888889 | 0 |
| 0.8333333333333334 | 0 |
| 0.8340277777777777 | 0 |
| 0.8347222222222223 | 0 |
| 0.8354166666666667 | 0 |
| 0.8361111111111111 | 0 |
| 0.8368055555555555 | 0 |
| 0.8375 | 0 |
| 0.8381944444444445 | 0 |
| 0.8388888888888889 | 0 |
| 0.8395833333333332 | 0 |
| 0.8402777777777778 | 0 |
| 0.8409722222222222 | 0 |
| 0.8416666666666667 | 0 |
| 0.842361111111111 | 0 |
| 0.8430555555555556 | 0 |
| 0.84375 | 0 |
| 0.8444444444444444 | 0 |
| 0.845138888888889 | 0 |
| 0.8458333333333333 | 0 |
| 0.8465277777777778 | 0 |
| 0.8472222222222222 | 0 |
| 0.8479166666666668 | 0 |
| 0.8486111111111111 | 0 |
| 0.8493055555555555 | 0 |
| 0.85 | 0 |
| 0.8506944444444445 | 0 |
| 0.8513888888888889 | 0 |
| 0.8520833333333333 | 0 |
| 0.8527777777777777 | 0 |
| 0.8534722222222223 | 0 |
| 0.8541666666666666 | 0 |
| 0.8548611111111111 | 0 |
| 0.8555555555555556 | 0 |
| 0.8562500000000001 | 0 |
| 0.8569444444444444 | 0 |
| 0.8576388888888888 | 0 |
| 0.8583333333333334 | 0 |
| 0.8590277777777778 | 0 |
| 0.8597222222222222 | 0 |
| 0.8604166666666666 | 0 |
| 0.8611111111111112 | 0 |
| 0.8618055555555556 | 0 |
| 0.8624999999999999 | 0 |
| 0.8631944444444444 | 0 |
| 0.8638888888888889 | 0 |
| 0.8645833333333334 | 0 |
| 0.8652777777777777 | 0 |
| 0.8659722222222223 | 0 |
| 0.8666666666666667 | 0 |
| 0.8673611111111111 | 0 |
| 0.8680555555555555 | 0 |
| 0.86875 | 0 |
| 0.8694444444444445 | 0 |
| 0.8701388888888889 | 0 |
| 0.8708333333333332 | 0 |
| 0.8715277777777778 | 0 |
| 0.8722222222222222 | 0 |
| 0.8729166666666667 | 0 |
| 0.873611111111111 | 0 |
| 0.8743055555555556 | 0 |
| 0.875 | 0 |
| 0.8756944444444444 | 0 |
| 0.876388888888889 | 0 |
| 0.8770833333333333 | 0 |
| 0.8777777777777778 | 0 |
| 0.8784722222222222 | 0 |
| 0.8791666666666668 | 0 |
| 0.8798611111111111 | 0 |
| 0.8805555555555555 | 0 |
| 0.88125 | 0 |
| 0.8819444444444445 | 0 |
| 0.8826388888888889 | 0 |
| 0.8833333333333333 | 0 |
| 0.8840277777777777 | 0 |
| 0.8847222222222223 | 0 |
| 0.8854166666666666 | 0 |
| 0.8861111111111111 | 0 |
| 0.8868055555555556 | 0 |
| 0.8875000000000001 | 0 |
| 0.8881944444444444 | 0 |
| 0.8888888888888888 | 0 |
| 0.8895833333333334 | 0 |
| 0.8902777777777778 | 0 |
| 0.8909722222222222 | 0 |
| 0.8916666666666666 | 0 |
| 0.8923611111111112 | 0 |
| 0.8930555555555556 | 0 |
| 0.8937499999999999 | 0 |
| 0.8944444444444444 | 0 |
| 0.8951388888888889 | 0 |
| 0.8958333333333334 | 0 |
| 0.8965277777777777 | 0 |
| 0.8972222222222223 | 0 |
| 0.8979166666666667 | 0 |
| 0.8986111111111111 | 0 |
| 0.8993055555555555 | 0 |
| 0.9 | 0 |
| 0.9006944444444445 | 0 |
| 0.9013888888888889 | 0 |
| 0.9020833333333332 | 0 |
| 0.9027777777777778 | 0 |
| 0.9034722222222222 | 0 |
| 0.9041666666666667 | 0 |
| 0.904861111111111 | 0 |
| 0.9055555555555556 | 0 |
| 0.90625 | 0 |
| 0.9069444444444444 | 0 |
| 0.907638888888889 | 0 |
| 0.9083333333333333 | 0 |
| 0.9090277777777778 | 0 |
| 0.9097222222222222 | 0 |
| 0.9104166666666668 | 0 |
| 0.9111111111111111 | 0 |
| 0.9118055555555555 | 0 |
| 0.9125 | 0 |
| 0.9131944444444445 | 0 |
| 0.9138888888888889 | 0 |
| 0.9145833333333333 | 0 |
| 0.9152777777777777 | 0 |
| 0.9159722222222223 | 0 |
| 0.9166666666666666 | 0 |
| 0.9173611111111111 | 0 |
| 0.9180555555555556 | 0 |
| 0.9187500000000001 | 0 |
| 0.9194444444444444 | 0 |
| 0.9201388888888888 | 0 |
| 0.9208333333333334 | 0 |
| 0.9215277777777778 | 0 |
| 0.9222222222222222 | 0 |
| 0.9229166666666666 | 0 |
| 0.9236111111111112 | 0 |
| 0.9243055555555556 | 0 |
| 0.9249999999999999 | 0 |
| 0.9256944444444444 | 0 |
| 0.9263888888888889 | 0 |
| 0.9270833333333334 | 0 |
| 0.9277777777777777 | 0 |
| 0.9284722222222223 | 0 |
| 0.9291666666666667 | 0 |
| 0.9298611111111111 | 0 |
| 0.9305555555555555 | 0 |
| 0.93125 | 0 |
| 0.9319444444444445 | 0 |
| 0.9326388888888889 | 0 |
| 0.9333333333333332 | 0 |
| 0.9340277777777778 | 0 |
| 0.9347222222222222 | 0 |
| 0.9354166666666667 | 0 |
| 0.936111111111111 | 0 |
| 0.9368055555555556 | 0 |
| 0.9375 | 0 |
| 0.9381944444444444 | 0 |
| 0.938888888888889 | 0 |
| 0.9395833333333333 | 0 |
| 0.9402777777777778 | 0 |
| 0.9409722222222222 | 0 |
| 0.9416666666666668 | 0 |
| 0.9423611111111111 | 0 |
| 0.9430555555555555 | 0 |
| 0.94375 | 0 |
| 0.9444444444444445 | 0 |
| 0.9451388888888889 | 0 |
| 0.9458333333333333 | 0 |
| 0.9465277777777777 | 0 |
| 0.9472222222222223 | 0 |
| 0.9479166666666666 | 0 |
| 0.9486111111111111 | 0 |
| 0.9493055555555556 | 0 |
| 0.9500000000000001 | 0 |
| 0.9506944444444444 | 0 |
| 0.9513888888888888 | 0 |
| 0.9520833333333334 | 0 |
| 0.9527777777777778 | 0 |
| 0.9534722222222222 | 0 |
| 0.9541666666666666 | 0 |
| 0.9548611111111112 | 0 |
| 0.9555555555555556 | 0 |
| 0.9562499999999999 | 0 |
| 0.9569444444444444 | 0 |
| 0.9576388888888889 | 0 |
| 0.9583333333333334 | 0 |
| 0.9590277777777777 | 0 |
| 0.9597222222222223 | 0 |
| 0.9604166666666667 | 0 |
| 0.9611111111111111 | 0 |
| 0.9618055555555555 | 0 |
| 0.9625 | 0 |
| 0.9631944444444445 | 0 |
| 0.9638888888888889 | 0 |
| 0.9645833333333332 | 0 |
| 0.9652777777777778 | 0 |
| 0.9659722222222222 | 0 |
| 0.9666666666666667 | 0 |
| 0.967361111111111 | 0 |
| 0.9680555555555556 | 0 |
| 0.96875 | 0 |
| 0.9694444444444444 | 0 |
| 0.970138888888889 | 0 |
| 0.9708333333333333 | 0 |
| 0.9715277777777778 | 0 |
| 0.9722222222222222 | 0 |
| 0.9729166666666668 | 0 |
| 0.9736111111111111 | 0 |
| 0.9743055555555555 | 0 |
| 0.975 | 0 |
| 0.9756944444444445 | 0 |
| 0.9763888888888889 | 0 |
| 0.9770833333333333 | 0 |
| 0.9777777777777777 | 0 |
| 0.9784722222222223 | 0 |
| 0.9791666666666666 | 0 |
| 0.9798611111111111 | 0 |
| 0.9805555555555556 | 0 |
| 0.9812500000000001 | 0 |
| 0.9819444444444444 | 0 |
| 0.9826388888888888 | 0 |
| 0.9833333333333334 | 0 |
| 0.9840277777777778 | 0 |
| 0.9847222222222222 | 0 |
| 0.9854166666666666 | 0 |
| 0.9861111111111112 | 0 |
| 0.9868055555555556 | 0 |
| 0.9874999999999999 | 0 |
| 0.9881944444444444 | 0 |
| 0.9888888888888889 | 0 |
| 0.9895833333333334 | 0 |
| 0.9902777777777777 | 0 |
| 0.9909722222222223 | 0 |
| 0.9916666666666667 | 0 |
| 0.9923611111111111 | 0 |
| 0.9930555555555555 | 0 |
| 0.99375 | 0 |
| 0.9944444444444445 | 0 |
| 0.9951388888888889 | 0 |
| 0.9958333333333332 | 0 |
| 0.9965277777777778 | 0 |
| 0.9972222222222222 | 0 |
| 0.9979166666666667 | 0 |
| 0.998611111111111 | 0 |
| 0.9993055555555556 | 0 |